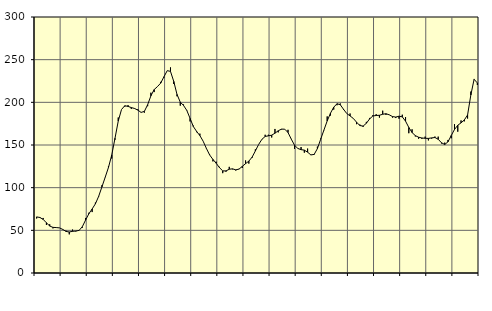
| Category | Piggar | Series 1 |
|---|---|---|
| nan | 63.9 | 65.74 |
| 87.0 | 65.5 | 65.05 |
| 87.0 | 64.5 | 62.82 |
| 87.0 | 56.3 | 58.82 |
| nan | 57.1 | 55.05 |
| 88.0 | 52.3 | 53.47 |
| 88.0 | 53.4 | 53.23 |
| 88.0 | 52.8 | 52.88 |
| nan | 51.4 | 51.08 |
| 89.0 | 49.6 | 48.73 |
| 89.0 | 45.3 | 48.09 |
| 89.0 | 50.9 | 48.81 |
| nan | 48.7 | 49.19 |
| 90.0 | 49.6 | 49.9 |
| 90.0 | 53.1 | 54.28 |
| 90.0 | 64.5 | 62.09 |
| nan | 70.6 | 69.43 |
| 91.0 | 71.4 | 75.02 |
| 91.0 | 82.5 | 81.06 |
| 91.0 | 89.3 | 89.84 |
| nan | 102.8 | 100.93 |
| 92.0 | 112 | 112.19 |
| 92.0 | 125.1 | 123.67 |
| 92.0 | 134.2 | 138.2 |
| nan | 156.2 | 157.85 |
| 93.0 | 182.2 | 178.07 |
| 93.0 | 191.6 | 191.6 |
| 93.0 | 194.9 | 196 |
| nan | 196.7 | 195.24 |
| 94.0 | 192.3 | 193.87 |
| 94.0 | 192.5 | 192.81 |
| 94.0 | 191.9 | 190.87 |
| nan | 188 | 188.2 |
| 95.0 | 187.9 | 189.4 |
| 95.0 | 195.5 | 197.18 |
| 95.0 | 211.3 | 207.61 |
| nan | 212 | 214.95 |
| 96.0 | 218.3 | 218.42 |
| 96.0 | 224 | 222.52 |
| 96.0 | 229 | 229.96 |
| nan | 237.1 | 237.13 |
| 97.0 | 240.9 | 236.27 |
| 97.0 | 221.5 | 224.5 |
| 97.0 | 207.1 | 209.27 |
| nan | 196.1 | 200.23 |
| 98.0 | 197.5 | 196.33 |
| 98.0 | 190.2 | 190.55 |
| 98.0 | 177.6 | 181.19 |
| nan | 172.7 | 171.66 |
| 99.0 | 165 | 165.94 |
| 99.0 | 163.3 | 161.05 |
| 99.0 | 154.5 | 154.5 |
| nan | 145.5 | 145.99 |
| 0.0 | 138.7 | 138.29 |
| 0.0 | 130.8 | 133.11 |
| 0.0 | 130.4 | 128.6 |
| nan | 124.4 | 123.46 |
| 1.0 | 117 | 119.69 |
| 1.0 | 118.7 | 119.64 |
| 1.0 | 124.4 | 121.61 |
| nan | 121.5 | 122.06 |
| 2.0 | 120.1 | 120.9 |
| 2.0 | 122 | 121.75 |
| 2.0 | 123.1 | 124.96 |
| nan | 131.9 | 128.14 |
| 3.0 | 128.2 | 131.12 |
| 3.0 | 135 | 135.76 |
| 3.0 | 144.9 | 143.04 |
| nan | 150.6 | 150.64 |
| 4.0 | 156.4 | 156.62 |
| 4.0 | 162 | 160.02 |
| 4.0 | 162 | 160.73 |
| nan | 158.8 | 161.53 |
| 5.0 | 168.8 | 163.83 |
| 5.0 | 164.8 | 166.68 |
| 5.0 | 168.2 | 168.62 |
| nan | 168.5 | 168.52 |
| 6.0 | 167.8 | 164.63 |
| 6.0 | 157.1 | 156.9 |
| 6.0 | 145.4 | 149.75 |
| nan | 146.2 | 145.93 |
| 7.0 | 147.6 | 144.56 |
| 7.0 | 141 | 143.98 |
| 7.0 | 145.8 | 141.58 |
| nan | 138.2 | 138.4 |
| 8.0 | 138.4 | 138.95 |
| 8.0 | 148.1 | 145.74 |
| 8.0 | 157.5 | 156.68 |
| nan | 167.3 | 167.51 |
| 9.0 | 183.5 | 178.18 |
| 9.0 | 184.5 | 187.23 |
| 9.0 | 191.5 | 194.29 |
| nan | 196.6 | 198.36 |
| 10.0 | 198.7 | 197.21 |
| 10.0 | 191.1 | 191.87 |
| 10.0 | 186.8 | 186.89 |
| nan | 186.9 | 184.09 |
| 11.0 | 181.3 | 181.13 |
| 11.0 | 174.4 | 176.72 |
| 11.0 | 174 | 172.82 |
| nan | 171.2 | 172.14 |
| 12.0 | 177.1 | 175.45 |
| 12.0 | 181.7 | 180.63 |
| 12.0 | 185 | 184.01 |
| nan | 186.1 | 184.57 |
| 13.0 | 182.1 | 184.83 |
| 13.0 | 190.2 | 186.02 |
| 13.0 | 185.3 | 186.65 |
| nan | 185.3 | 185.39 |
| 14.0 | 182.1 | 183.34 |
| 14.0 | 181.6 | 182.72 |
| 14.0 | 180.8 | 183.77 |
| nan | 185.5 | 182.96 |
| 15.0 | 182.8 | 177.94 |
| 15.0 | 163.8 | 170.6 |
| 15.0 | 168.4 | 164.54 |
| nan | 160 | 160.99 |
| 16.0 | 157.3 | 159.13 |
| 16.0 | 157.2 | 158.23 |
| 16.0 | 159.8 | 157.87 |
| nan | 155.4 | 157.73 |
| 17.0 | 157.5 | 158.32 |
| 17.0 | 159.9 | 158.79 |
| 17.0 | 159.8 | 156.71 |
| nan | 151.8 | 152.67 |
| 18.0 | 152.8 | 150.57 |
| 18.0 | 155.9 | 153.74 |
| 18.0 | 157.9 | 161.15 |
| nan | 174.4 | 168.2 |
| 19.0 | 165.6 | 173.13 |
| 19.0 | 178.8 | 175.94 |
| 19.0 | 177.7 | 179.35 |
| nan | 181 | 185.11 |
| 20.0 | 212.6 | 208.58 |
| 20.0 | 227.4 | 227.02 |
| 20.0 | 220.3 | 222.69 |